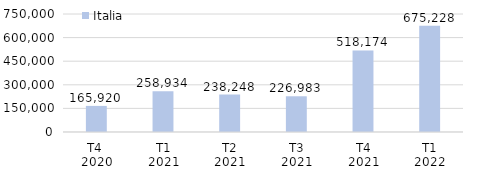
| Category | Italia |
|---|---|
| T4 
2020 | 165920.489 |
| T1
2021 | 258933.889 |
| T2
2021 | 238247.791 |
| T3
2021 | 226983 |
| T4
2021 | 518173.522 |
| T1
2022 | 675227.656 |